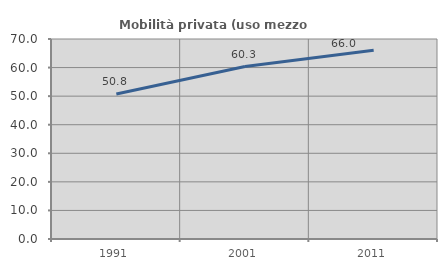
| Category | Mobilità privata (uso mezzo privato) |
|---|---|
| 1991.0 | 50.78 |
| 2001.0 | 60.343 |
| 2011.0 | 66.047 |